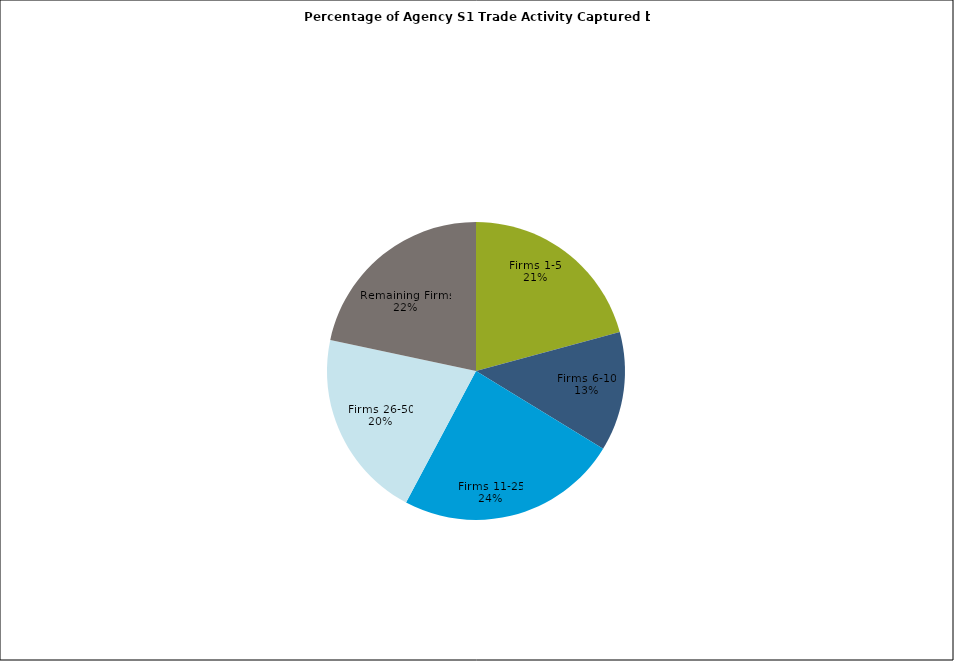
| Category | Series 0 |
|---|---|
| Firms 1-5 | 0.208 |
| Firms 6-10 | 0.13 |
| Firms 11-25 | 0.24 |
| Firms 26-50 | 0.206 |
| Remaining Firms | 0.217 |